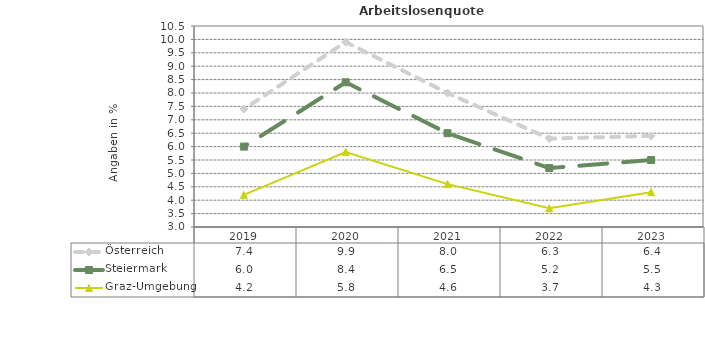
| Category | Österreich | Steiermark | Graz-Umgebung |
|---|---|---|---|
| 2023.0 | 6.4 | 5.5 | 4.3 |
| 2022.0 | 6.3 | 5.2 | 3.7 |
| 2021.0 | 8 | 6.5 | 4.6 |
| 2020.0 | 9.9 | 8.4 | 5.8 |
| 2019.0 | 7.4 | 6 | 4.2 |